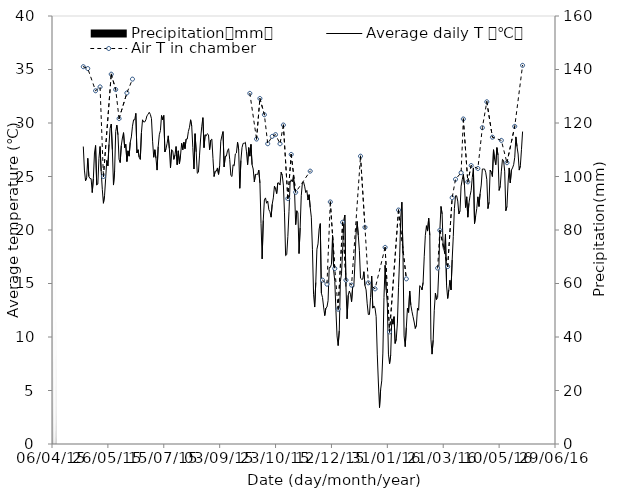
| Category | Precipitation（mm） |
|---|---|
| 2015-04-29 | 1 |
| 2015-04-30 | 12.8 |
| 2015-05-01 | 12.1 |
| 2015-05-02 | 0 |
| 2015-05-03 | 38 |
| 2015-05-04 | 2.4 |
| 2015-05-05 | 103.1 |
| 2015-05-06 | 44.1 |
| 2015-05-07 | 139.4 |
| 2015-05-08 | 3.9 |
| 2015-05-09 | 37.4 |
| 2015-05-10 | 0 |
| 2015-05-11 | 44.5 |
| 2015-05-12 | 0 |
| 2015-05-13 | 0 |
| 2015-05-14 | 0 |
| 2015-05-15 | 0 |
| 2015-05-16 | 40.4 |
| 2015-05-17 | 47.5 |
| 2015-05-18 | 2.1 |
| 2015-05-19 | 0.1 |
| 2015-05-20 | 63.2 |
| 2015-05-21 | 43.8 |
| 2015-05-22 | 8 |
| 2015-05-23 | 28.1 |
| 2015-05-24 | 15.4 |
| 2015-05-25 | 30.7 |
| 2015-05-26 | 22.6 |
| 2015-05-27 | 0 |
| 2015-05-28 | 0.1 |
| 2015-05-29 | 0 |
| 2015-05-30 | 54.1 |
| 2015-05-31 | 24.6 |
| 2015-06-01 | 28.8 |
| 2015-06-02 | 1.7 |
| 2015-06-03 | 0 |
| 2015-06-04 | 19 |
| 2015-06-05 | 40.8 |
| 2015-06-06 | 1.6 |
| 2015-06-07 | 0 |
| 2015-06-08 | 6 |
| 2015-06-09 | 0.5 |
| 2015-06-10 | 15 |
| 2015-06-11 | 25.4 |
| 2015-06-12 | 15.9 |
| 2015-06-13 | 17.3 |
| 2015-06-14 | 10.7 |
| 2015-06-15 | 6.4 |
| 2015-06-16 | 1.5 |
| 2015-06-17 | 0 |
| 2015-06-18 | 0 |
| 2015-06-19 | 0 |
| 2015-06-20 | 0 |
| 2015-06-21 | 10.9 |
| 2015-06-22 | 17.8 |
| 2015-06-23 | 11.2 |
| 2015-06-24 | 13.7 |
| 2015-06-25 | 2.2 |
| 2015-06-26 | 5.2 |
| 2015-06-27 | 0.2 |
| 2015-06-28 | 0 |
| 2015-06-29 | 0 |
| 2015-06-30 | 0 |
| 2015-07-01 | 0 |
| 2015-07-02 | 0 |
| 2015-07-03 | 0 |
| 2015-07-04 | 0 |
| 2015-07-05 | 16.1 |
| 2015-07-06 | 0 |
| 2015-07-07 | 0 |
| 2015-07-08 | 0 |
| 2015-07-09 | 3.3 |
| 2015-07-10 | 59 |
| 2015-07-11 | 0 |
| 2015-07-12 | 0 |
| 2015-07-13 | 0 |
| 2015-07-14 | 0 |
| 2015-07-15 | 0 |
| 2015-07-16 | 102.5 |
| 2015-07-17 | 31.9 |
| 2015-07-18 | 126.1 |
| 2015-07-19 | 12.5 |
| 2015-07-20 | 13.2 |
| 2015-07-21 | 33.8 |
| 2015-07-22 | 0 |
| 2015-07-23 | 6.8 |
| 2015-07-24 | 4.7 |
| 2015-07-25 | 0.1 |
| 2015-07-26 | 6.4 |
| 2015-07-27 | 17 |
| 2015-07-28 | 0 |
| 2015-07-29 | 0 |
| 2015-07-30 | 7.8 |
| 2015-07-31 | 0 |
| 2015-08-01 | 0 |
| 2015-08-02 | 0 |
| 2015-08-03 | 0 |
| 2015-08-04 | 0 |
| 2015-08-05 | 0 |
| 2015-08-06 | 0 |
| 2015-08-07 | 0 |
| 2015-08-08 | 0 |
| 2015-08-09 | 0 |
| 2015-08-10 | 13.3 |
| 2015-08-11 | 92.1 |
| 2015-08-12 | 10.3 |
| 2015-08-13 | 23.6 |
| 2015-08-14 | 73.6 |
| 2015-08-15 | 15.4 |
| 2015-08-16 | 0 |
| 2015-08-17 | 0.4 |
| 2015-08-18 | 0 |
| 2015-08-19 | 0 |
| 2015-08-20 | 39.9 |
| 2015-08-21 | 0 |
| 2015-08-22 | 0 |
| 2015-08-23 | 0 |
| 2015-08-24 | 0 |
| 2015-08-25 | 0 |
| 2015-08-26 | 0 |
| 2015-08-27 | 0 |
| 2015-08-28 | 4.1 |
| 2015-08-29 | 35.1 |
| 2015-08-30 | 25.2 |
| 2015-08-31 | 9.7 |
| 2015-09-01 | 11.7 |
| 2015-09-02 | 41.3 |
| 2015-09-03 | 3.1 |
| 2015-09-04 | 0 |
| 2015-09-05 | 0 |
| 2015-09-06 | 0 |
| 2015-09-07 | 30.9 |
| 2015-09-08 | 0 |
| 2015-09-09 | 0 |
| 2015-09-10 | 0 |
| 2015-09-11 | 0 |
| 2015-09-12 | 1.6 |
| 2015-09-13 | 0 |
| 2015-09-14 | 0 |
| 2015-09-15 | 0 |
| 2015-09-16 | 0.3 |
| 2015-09-17 | 0.1 |
| 2015-09-18 | 0 |
| 2015-09-19 | 0 |
| 2015-09-20 | 4.8 |
| 2015-09-21 | 21.9 |
| 2015-09-22 | 0.7 |
| 2015-09-23 | 0 |
| 2015-09-24 | 0 |
| 2015-09-25 | 0 |
| 2015-09-26 | 0 |
| 2015-09-27 | 0 |
| 2015-09-28 | 0 |
| 2015-09-29 | 0 |
| 2015-09-30 | 0 |
| 2015-10-01 | 0 |
| 2015-10-02 | 0 |
| 2015-10-03 | 0 |
| 2015-10-04 | 57.3 |
| 2015-10-05 | 24.9 |
| 2015-10-06 | 4.7 |
| 2015-10-07 | 31.9 |
| 2015-10-08 | 0.7 |
| 2015-10-09 | 0 |
| 2015-10-10 | 1 |
| 2015-10-11 | 1 |
| 2015-10-12 | 0 |
| 2015-10-13 | 0 |
| 2015-10-14 | 0 |
| 2015-10-15 | 0 |
| 2015-10-16 | 0 |
| 2015-10-17 | 0 |
| 2015-10-18 | 0 |
| 2015-10-19 | 0 |
| 2015-10-20 | 0 |
| 2015-10-21 | 0 |
| 2015-10-22 | 0 |
| 2015-10-23 | 0 |
| 2015-10-24 | 0 |
| 2015-10-25 | 0.1 |
| 2015-10-26 | 0 |
| 2015-10-27 | 0.1 |
| 2015-10-28 | 0 |
| 2015-10-29 | 0.4 |
| 2015-10-30 | 0.9 |
| 2015-10-31 | 0 |
| 2015-11-01 | 0.4 |
| 2015-11-02 | 0 |
| 2015-11-03 | 0 |
| 2015-11-04 | 0 |
| 2015-11-05 | 0 |
| 2015-11-06 | 0.2 |
| 2015-11-07 | 1.4 |
| 2015-11-08 | 1 |
| 2015-11-09 | 0 |
| 2015-11-10 | 0 |
| 2015-11-11 | 0 |
| 2015-11-12 | 0.3 |
| 2015-11-13 | 40.9 |
| 2015-11-14 | 0 |
| 2015-11-15 | 0.5 |
| 2015-11-16 | 0 |
| 2015-11-17 | 0 |
| 2015-11-18 | 0 |
| 2015-11-19 | 0 |
| 2015-11-20 | 0 |
| 2015-11-21 | 0 |
| 2015-11-22 | 0 |
| 2015-11-23 | 0 |
| 2015-11-24 | 0 |
| 2015-11-25 | 0 |
| 2015-11-26 | 0 |
| 2015-11-27 | 0 |
| 2015-11-28 | 0 |
| 2015-11-29 | 0 |
| 2015-11-30 | 0 |
| 2015-12-01 | 0 |
| 2015-12-02 | 0 |
| 2015-12-03 | 17.6 |
| 2015-12-04 | 7.5 |
| 2015-12-05 | 10.9 |
| 2015-12-06 | 5.9 |
| 2015-12-07 | 0 |
| 2015-12-08 | 0 |
| 2015-12-09 | 38.6 |
| 2015-12-10 | 2.4 |
| 2015-12-11 | 0 |
| 2015-12-12 | 0 |
| 2015-12-13 | 0 |
| 2015-12-14 | 3.7 |
| 2015-12-15 | 0 |
| 2015-12-16 | 0 |
| 2015-12-17 | 0 |
| 2015-12-18 | 0 |
| 2015-12-19 | 0 |
| 2015-12-20 | 0 |
| 2015-12-21 | 1.3 |
| 2015-12-22 | 0.7 |
| 2015-12-23 | 0 |
| 2015-12-24 | 2.1 |
| 2015-12-25 | 2 |
| 2015-12-26 | 0.9 |
| 2015-12-27 | 8.9 |
| 2015-12-28 | 0 |
| 2015-12-29 | 0 |
| 2015-12-30 | 3.6 |
| 2015-12-31 | 0 |
| 2016-01-01 | 0 |
| 2016-01-02 | 0 |
| 2016-01-03 | 0 |
| 2016-01-04 | 0 |
| 2016-01-05 | 120.7 |
| 2016-01-06 | 0 |
| 2016-01-07 | 0 |
| 2016-01-08 | 0 |
| 2016-01-09 | 0 |
| 2016-01-10 | 9.8 |
| 2016-01-11 | 20.3 |
| 2016-01-12 | 0 |
| 2016-01-13 | 0 |
| 2016-01-14 | 2.5 |
| 2016-01-15 | 22.3 |
| 2016-01-16 | 2.5 |
| 2016-01-17 | 12.3 |
| 2016-01-18 | 0 |
| 2016-01-19 | 0 |
| 2016-01-20 | 4.8 |
| 2016-01-21 | 4.5 |
| 2016-01-22 | 1.6 |
| 2016-01-23 | 6 |
| 2016-01-24 | 4.8 |
| 2016-01-25 | 0 |
| 2016-01-26 | 7.8 |
| 2016-01-27 | 32.5 |
| 2016-01-28 | 91.5 |
| 2016-01-29 | 61.3 |
| 2016-01-30 | 0 |
| 2016-01-31 | 5 |
| 2016-02-01 | 21.5 |
| 2016-02-02 | 0.4 |
| 2016-02-03 | 0 |
| 2016-02-04 | 0 |
| 2016-02-05 | 0 |
| 2016-02-06 | 0 |
| 2016-02-07 | 0 |
| 2016-02-08 | 0 |
| 2016-02-09 | 0 |
| 2016-02-10 | 0.6 |
| 2016-02-11 | 0.5 |
| 2016-02-12 | 0 |
| 2016-02-13 | 0 |
| 2016-02-14 | 0 |
| 2016-02-15 | 0 |
| 2016-02-16 | 0 |
| 2016-02-17 | 0 |
| 2016-02-18 | 0 |
| 2016-02-19 | 14.4 |
| 2016-02-20 | 0.5 |
| 2016-02-21 | 0 |
| 2016-02-22 | 2.2 |
| 2016-02-23 | 0.4 |
| 2016-02-24 | 0 |
| 2016-02-25 | 0.3 |
| 2016-02-26 | 1 |
| 2016-02-27 | 0 |
| 2016-02-28 | 0 |
| 2016-02-29 | 0 |
| 2016-03-01 | 0 |
| 2016-03-02 | 0 |
| 2016-03-03 | 0 |
| 2016-03-04 | 0 |
| 2016-03-05 | 0 |
| 2016-03-06 | 0 |
| 2016-03-07 | 0 |
| 2016-03-08 | 0 |
| 2016-03-09 | 31.7 |
| 2016-03-10 | 32.8 |
| 2016-03-11 | 0 |
| 2016-03-12 | 0.5 |
| 2016-03-13 | 7.3 |
| 2016-03-14 | 0 |
| 2016-03-15 | 0.1 |
| 2016-03-16 | 1.1 |
| 2016-03-17 | 5.1 |
| 2016-03-18 | 4.2 |
| 2016-03-19 | 2.7 |
| 2016-03-20 | 0 |
| 2016-03-21 | 92.9 |
| 2016-03-22 | 21.6 |
| 2016-03-23 | 45.6 |
| 2016-03-24 | 6.9 |
| 2016-03-25 | 1.3 |
| 2016-03-26 | 0 |
| 2016-03-27 | 0 |
| 2016-03-28 | 0 |
| 2016-03-29 | 0 |
| 2016-03-30 | 0 |
| 2016-03-31 | 0 |
| 2016-04-01 | 0 |
| 2016-04-02 | 0 |
| 2016-04-03 | 0.1 |
| 2016-04-04 | 16.9 |
| 2016-04-05 | 0.1 |
| 2016-04-06 | 0 |
| 2016-04-07 | 0 |
| 2016-04-08 | 0 |
| 2016-04-09 | 18.7 |
| 2016-04-10 | 25.1 |
| 2016-04-11 | 0 |
| 2016-04-12 | 33.4 |
| 2016-04-13 | 9.2 |
| 2016-04-14 | 7.8 |
| 2016-04-15 | 3.2 |
| 2016-04-16 | 0 |
| 2016-04-17 | 0 |
| 2016-04-18 | 39.3 |
| 2016-04-19 | 1.5 |
| 2016-04-20 | 10.6 |
| 2016-04-21 | 9.1 |
| 2016-04-22 | 13.9 |
| 2016-04-23 | 2 |
| 2016-04-24 | 20.3 |
| 2016-04-25 | 2.1 |
| 2016-04-26 | 2.2 |
| 2016-04-27 | 45.7 |
| 2016-04-28 | 0 |
| 2016-04-29 | 0 |
| 2016-04-30 | 11.4 |
| 2016-05-01 | 3.3 |
| 2016-05-02 | 0.2 |
| 2016-05-03 | 11.6 |
| 2016-05-04 | 0 |
| 2016-05-05 | 3.1 |
| 2016-05-06 | 20.1 |
| 2016-05-07 | 4 |
| 2016-05-08 | 0 |
| 2016-05-09 | 0.8 |
| 2016-05-10 | 104.5 |
| 2016-05-11 | 0 |
| 2016-05-12 | 0 |
| 2016-05-13 | 0 |
| 2016-05-14 | 0 |
| 2016-05-15 | 27.7 |
| 2016-05-16 | 0.1 |
| 2016-05-17 | 0 |
| 2016-05-18 | 0 |
| 2016-05-19 | 0 |
| 2016-05-20 | 31.9 |
| 2016-05-21 | 8.3 |
| 2016-05-22 | 0 |
| 2016-05-23 | 0 |
| 2016-05-24 | 0 |
| 2016-05-25 | 0 |
| 2016-05-26 | 6.8 |
| 2016-05-27 | 6.6 |
| 2016-05-28 | 28.2 |
| 2016-05-29 | 35 |
| 2016-05-30 | 5.3 |
| 2016-05-31 | 0 |